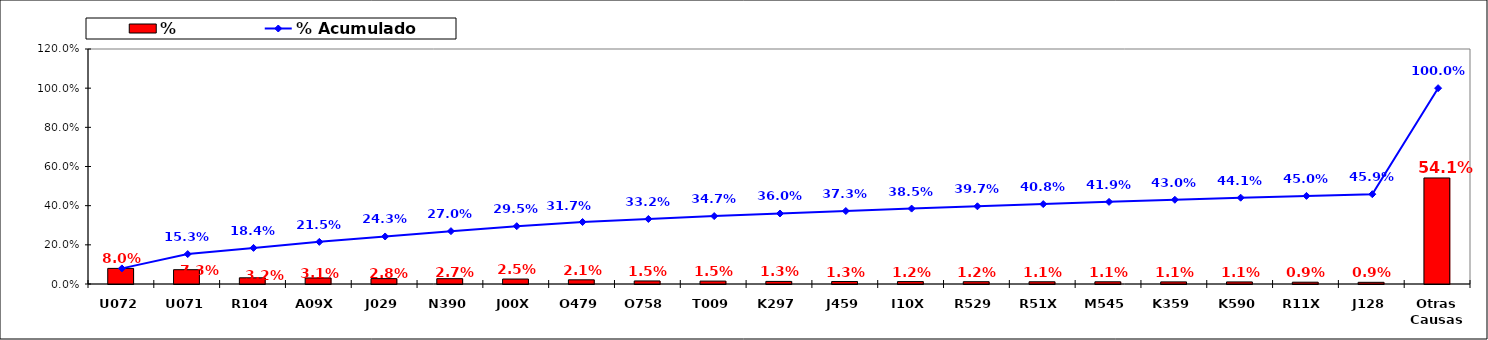
| Category | % |
|---|---|
| U072 | 0.08 |
| U071 | 0.073 |
| R104 | 0.032 |
| A09X | 0.031 |
| J029 | 0.028 |
| N390 | 0.027 |
| J00X | 0.025 |
| O479 | 0.021 |
| O758 | 0.015 |
| T009 | 0.015 |
| K297 | 0.013 |
| J459 | 0.013 |
| I10X | 0.012 |
| R529 | 0.012 |
| R51X | 0.011 |
| M545 | 0.011 |
| K359 | 0.011 |
| K590 | 0.011 |
| R11X | 0.009 |
| J128 | 0.009 |
| Otras Causas | 0.541 |